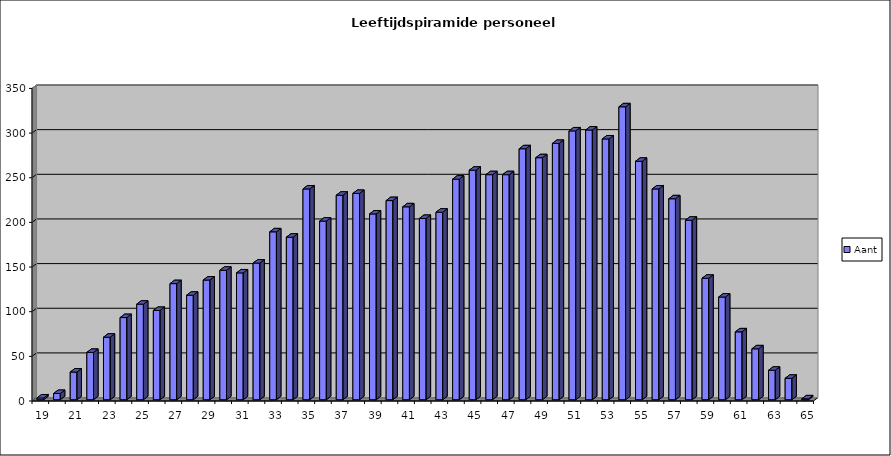
| Category | Aant |
|---|---|
| 19.0 | 2 |
| 20.0 | 7 |
| 21.0 | 31 |
| 22.0 | 53 |
| 23.0 | 70 |
| 24.0 | 92 |
| 25.0 | 107 |
| 26.0 | 100 |
| 27.0 | 130 |
| 28.0 | 117 |
| 29.0 | 134 |
| 30.0 | 145 |
| 31.0 | 142 |
| 32.0 | 153 |
| 33.0 | 188 |
| 34.0 | 182 |
| 35.0 | 236 |
| 36.0 | 200 |
| 37.0 | 229 |
| 38.0 | 231 |
| 39.0 | 208 |
| 40.0 | 223 |
| 41.0 | 216 |
| 42.0 | 203 |
| 43.0 | 210 |
| 44.0 | 247 |
| 45.0 | 257 |
| 46.0 | 252 |
| 47.0 | 252 |
| 48.0 | 281 |
| 49.0 | 271 |
| 50.0 | 287 |
| 51.0 | 301 |
| 52.0 | 302 |
| 53.0 | 292 |
| 54.0 | 328 |
| 55.0 | 267 |
| 56.0 | 236 |
| 57.0 | 225 |
| 58.0 | 201 |
| 59.0 | 136 |
| 60.0 | 115 |
| 61.0 | 76 |
| 62.0 | 57 |
| 63.0 | 33 |
| 64.0 | 24 |
| 65.0 | 1 |